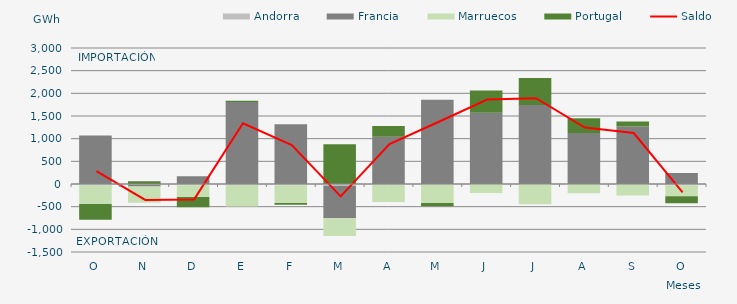
| Category | Andorra | Francia | Marruecos | Portugal |
|---|---|---|---|---|
| O | -30.452 | 1068.927 | -409.55 | -345.946 |
| N | -15.909 | -39.768 | -355.985 | 61.447 |
| D | -27.709 | 172.379 | -261.638 | -222.96 |
| E | -24.796 | 1810.619 | -470.016 | 24.492 |
| F | -25.31 | 1316.02 | -393.308 | -40.299 |
| M | -38.757 | -716.099 | -394.27 | 875.503 |
| A | -19.567 | 1043.23 | -378.646 | 237.582 |
| M | -12.003 | 1858.226 | -405.06 | -72.803 |
| J | -0.136 | 1569.713 | -200.627 | 495.014 |
| J | -0.226 | 1742.725 | -445.987 | 597.215 |
| A | -4.615 | 1125.357 | -201.623 | 324.903 |
| S | -3.339 | 1270.11 | -251.758 | 109.449 |
| O | -26.446 | 240.099 | -243.372 | -152.75 |